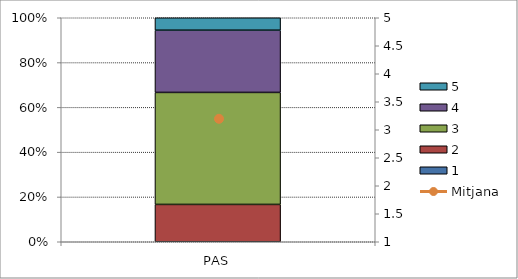
| Category | 1 | 2 | 3 | 4 | 5 |
|---|---|---|---|---|---|
| PAS | 0 | 3 | 9 | 5 | 1 |